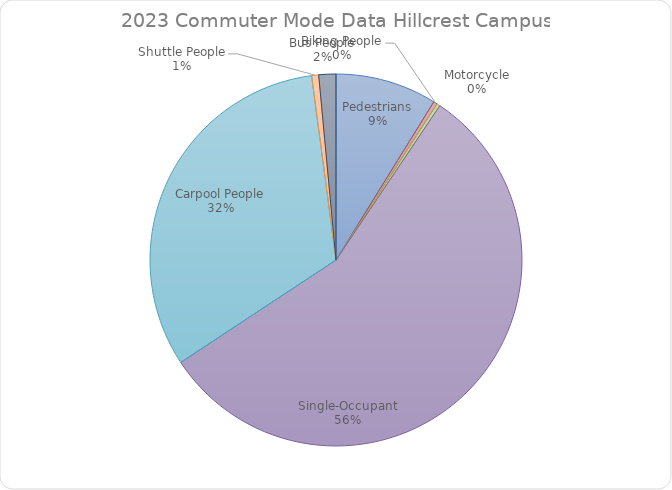
| Category | Series 0 |
|---|---|
| Pedestrians | 0.088 |
| Biking People | 0.003 |
| Motorcycle | 0.003 |
| Single-Occupant | 0.563 |
| Carpool People | 0.322 |
| Shuttle People | 0.006 |
| Bus People | 0.015 |